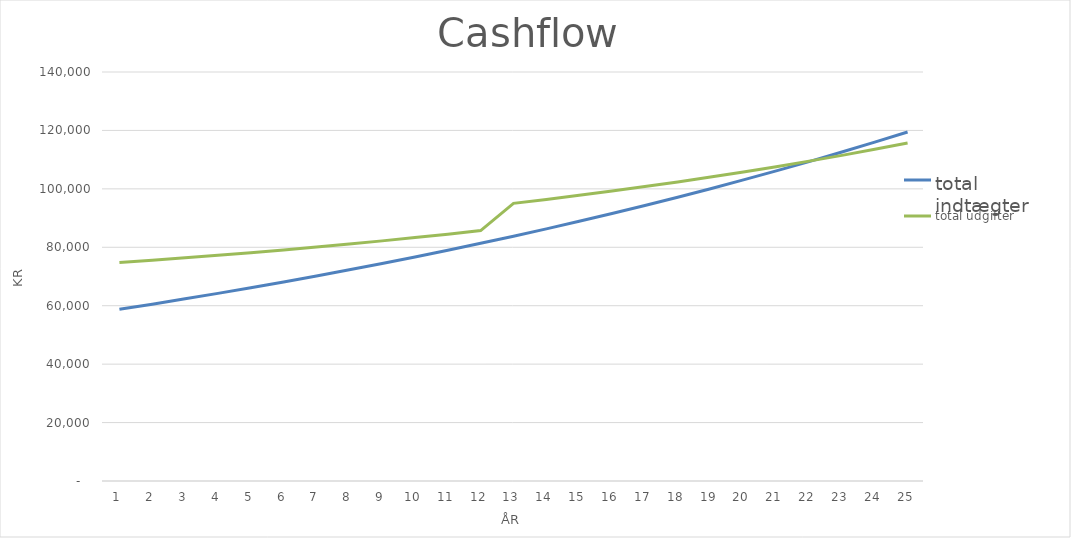
| Category | total indtægter | Series 1 | total udgifter |
|---|---|---|---|
| 0 | 58772.7 |  | 74809.24 |
| 1 | 60535.881 |  | 75591.956 |
| 2 | 62351.957 |  | 76411.635 |
| 3 | 64222.516 |  | 77269.815 |
| 4 | 66149.192 |  | 78168.094 |
| 5 | 68133.667 |  | 79108.131 |
| 6 | 70177.677 |  | 80091.652 |
| 7 | 72283.008 |  | 81120.444 |
| 8 | 74451.498 |  | 82196.368 |
| 9 | 76685.043 |  | 83321.353 |
| 10 | 78985.594 |  | 84497.403 |
| 11 | 81355.162 |  | 85726.599 |
| 12 | 83795.817 |  | 95039.159 |
| 13 | 86309.691 |  | 96381.21 |
| 14 | 88898.982 |  | 97783.137 |
| 15 | 91565.952 |  | 99247.358 |
| 16 | 94312.93 |  | 100776.38 |
| 17 | 97142.318 |  | 102372.807 |
| 18 | 100056.588 |  | 104039.34 |
| 19 | 103058.285 |  | 105778.783 |
| 20 | 106150.034 |  | 107594.046 |
| 21 | 109334.535 |  | 109488.149 |
| 22 | 112614.571 |  | 111464.225 |
| 23 | 115993.008 |  | 113525.524 |
| 24 | 119472.798 |  | 115675.419 |